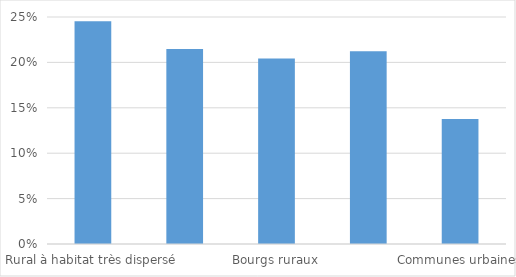
| Category | TEB_21 |
|---|---|
| Rural à habitat très dispersé | 0.245 |
| Rural à habitat dispersé | 0.215 |
| Bourgs ruraux | 0.204 |
| Ensemble communes rurales | 0.212 |
| Communes urbaines | 0.138 |